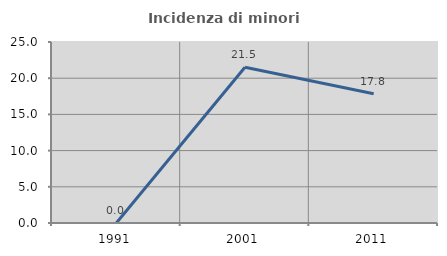
| Category | Incidenza di minori stranieri |
|---|---|
| 1991.0 | 0 |
| 2001.0 | 21.519 |
| 2011.0 | 17.84 |